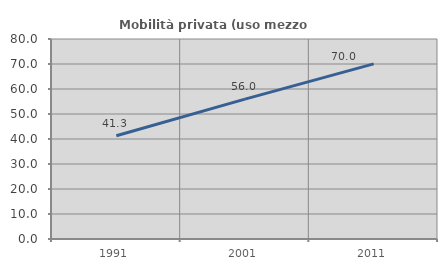
| Category | Mobilità privata (uso mezzo privato) |
|---|---|
| 1991.0 | 41.299 |
| 2001.0 | 55.959 |
| 2011.0 | 70.033 |